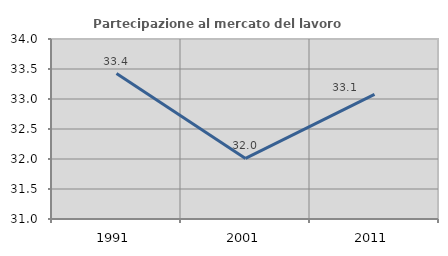
| Category | Partecipazione al mercato del lavoro  femminile |
|---|---|
| 1991.0 | 33.425 |
| 2001.0 | 32.01 |
| 2011.0 | 33.076 |